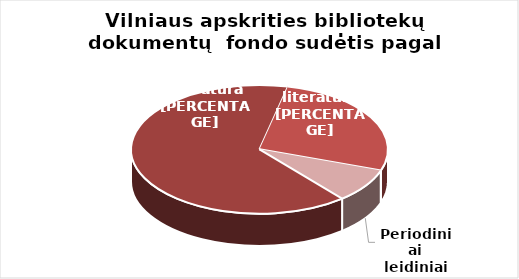
| Category | Series 0 |
|---|---|
| Grožinė literatūra* | 1229357 |
| Šakinė literatūra* | 509004 |
| Periodiniai leidiniai | 162775 |